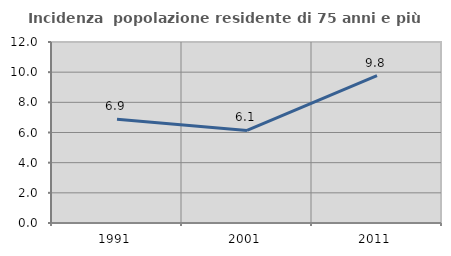
| Category | Incidenza  popolazione residente di 75 anni e più |
|---|---|
| 1991.0 | 6.871 |
| 2001.0 | 6.138 |
| 2011.0 | 9.773 |